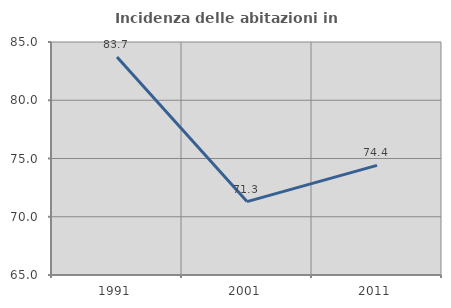
| Category | Incidenza delle abitazioni in proprietà  |
|---|---|
| 1991.0 | 83.704 |
| 2001.0 | 71.299 |
| 2011.0 | 74.412 |